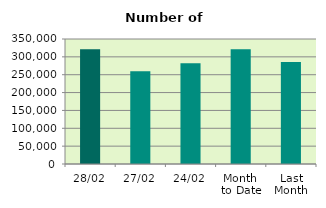
| Category | Series 0 |
|---|---|
| 28/02 | 321404 |
| 27/02 | 259404 |
| 24/02 | 282290 |
| Month 
to Date | 321374.6 |
| Last
Month | 285405.636 |